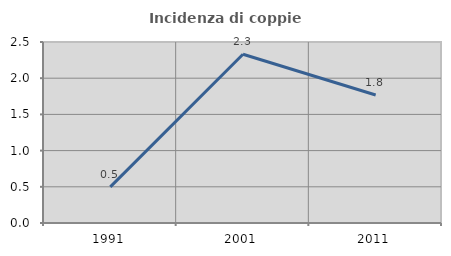
| Category | Incidenza di coppie miste |
|---|---|
| 1991.0 | 0.499 |
| 2001.0 | 2.331 |
| 2011.0 | 1.768 |